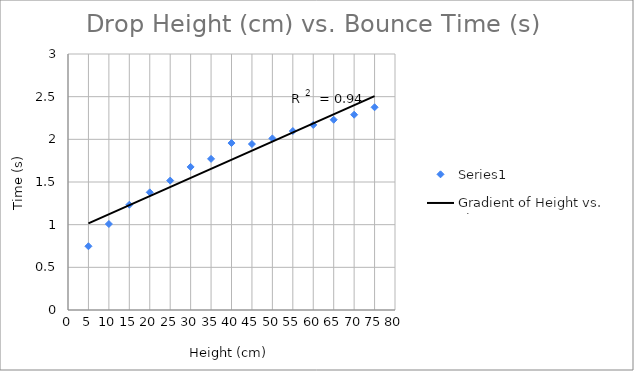
| Category | Series 0 |
|---|---|
| 5.0 | 0.747 |
| 10.0 | 1.008 |
| 15.0 | 1.233 |
| 20.0 | 1.379 |
| 25.0 | 1.517 |
| 30.0 | 1.677 |
| 35.0 | 1.771 |
| 40.0 | 1.956 |
| 45.0 | 1.945 |
| 50.0 | 2.011 |
| 55.0 | 2.097 |
| 60.0 | 2.169 |
| 65.0 | 2.23 |
| 70.0 | 2.288 |
| 75.0 | 2.376 |